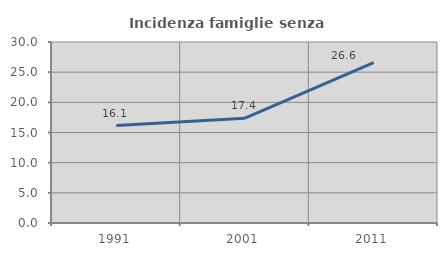
| Category | Incidenza famiglie senza nuclei |
|---|---|
| 1991.0 | 16.143 |
| 2001.0 | 17.374 |
| 2011.0 | 26.58 |